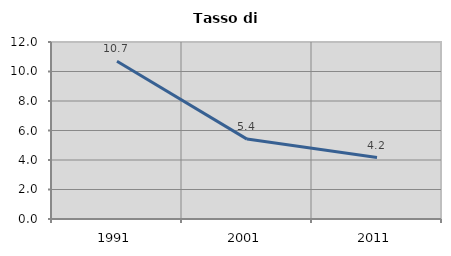
| Category | Tasso di disoccupazione   |
|---|---|
| 1991.0 | 10.7 |
| 2001.0 | 5.417 |
| 2011.0 | 4.167 |